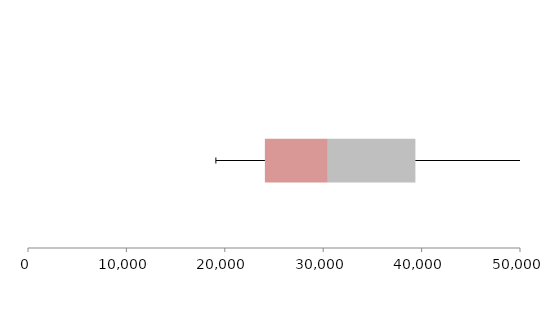
| Category | Series 1 | Series 2 | Series 3 |
|---|---|---|---|
| 0 | 24073.417 | 6396.73 | 8898.246 |